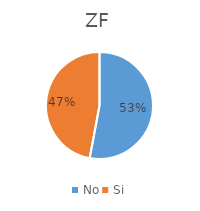
| Category | ZF |
|---|---|
| No | 0.529 |
| Si | 0.471 |